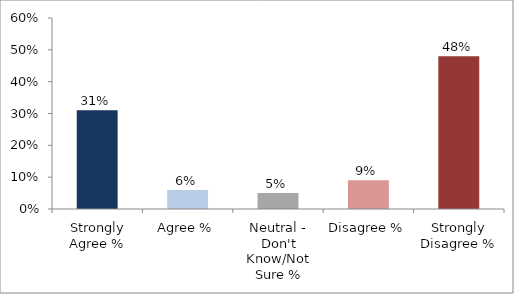
| Category | Share |
|---|---|
| Strongly Agree % | 0.31 |
| Agree % | 0.06 |
| Neutral - Don't Know/Not Sure % | 0.05 |
| Disagree % | 0.09 |
| Strongly Disagree % | 0.48 |